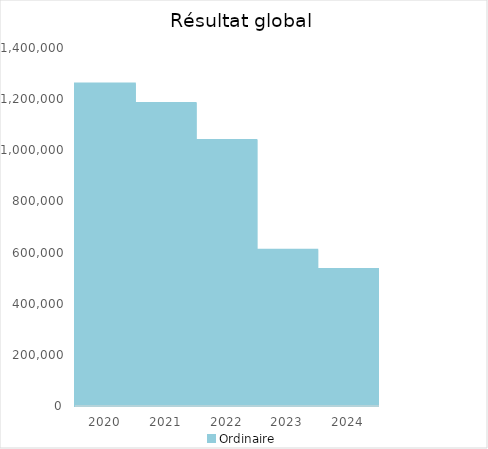
| Category |   | Ordinaire |    |
|---|---|---|---|
| 2020.0 |  | 1261401.78 |  |
| 2021.0 |  | 1184528.18 |  |
| 2022.0 |  | 1040252.77 |  |
| 2023.0 |  | 611117.3 |  |
| 2024.0 |  | 535655.63 |  |